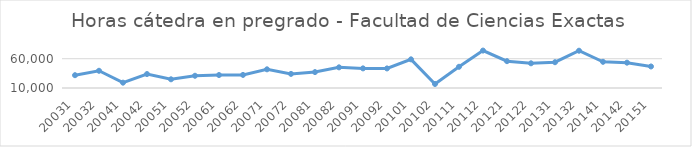
| Category | Total horas |
|---|---|
| 20031 | 31861 |
| 20032 | 39415 |
| 20041 | 19108 |
| 20042 | 33808 |
| 20051 | 24851 |
| 20052 | 30907 |
| 20061 | 32126 |
| 20062 | 32350 |
| 20071 | 41903 |
| 20072 | 34086 |
| 20081 | 37171 |
| 20082 | 45257 |
| 20091 | 43495 |
| 20092 | 43408 |
| 20101 | 58932 |
| 20102 | 16852 |
| 20111 | 46234 |
| 20112 | 73906 |
| 20121 | 55819 |
| 20122 | 52166 |
| 20131 | 54024 |
| 20132 | 73659 |
| 20141 | 54716 |
| 20142 | 53258 |
| 20151 | 46750 |